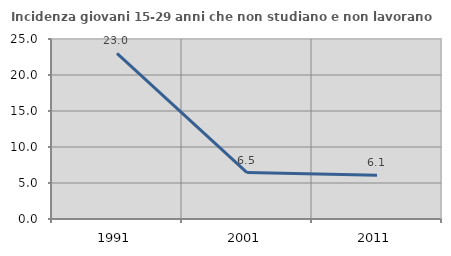
| Category | Incidenza giovani 15-29 anni che non studiano e non lavorano  |
|---|---|
| 1991.0 | 23.016 |
| 2001.0 | 6.452 |
| 2011.0 | 6.061 |